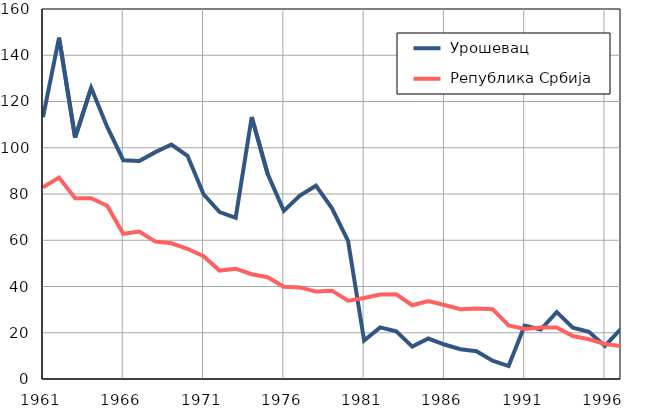
| Category |  Урошевац |  Република Србија |
|---|---|---|
| 1961.0 | 113.2 | 82.9 |
| 1962.0 | 147.6 | 87.1 |
| 1963.0 | 104.4 | 78.2 |
| 1964.0 | 125.9 | 78.2 |
| 1965.0 | 109 | 74.9 |
| 1966.0 | 94.6 | 62.8 |
| 1967.0 | 94.3 | 63.8 |
| 1968.0 | 98.1 | 59.4 |
| 1969.0 | 101.4 | 58.7 |
| 1970.0 | 96.5 | 56.3 |
| 1971.0 | 79.9 | 53.1 |
| 1972.0 | 72.2 | 46.9 |
| 1973.0 | 69.7 | 47.7 |
| 1974.0 | 113.3 | 45.3 |
| 1975.0 | 88.5 | 44 |
| 1976.0 | 72.7 | 39.9 |
| 1977.0 | 79.3 | 39.6 |
| 1978.0 | 83.6 | 37.8 |
| 1979.0 | 73.8 | 38.2 |
| 1980.0 | 59.7 | 33.9 |
| 1981.0 | 16.6 | 35 |
| 1982.0 | 22.3 | 36.5 |
| 1983.0 | 20.6 | 36.6 |
| 1984.0 | 14 | 31.9 |
| 1985.0 | 17.5 | 33.7 |
| 1986.0 | 14.9 | 32 |
| 1987.0 | 12.9 | 30.2 |
| 1988.0 | 12 | 30.5 |
| 1989.0 | 7.9 | 30.2 |
| 1990.0 | 5.6 | 23.2 |
| 1991.0 | 23.1 | 21.6 |
| 1992.0 | 21.4 | 22.3 |
| 1993.0 | 28.9 | 22.3 |
| 1994.0 | 22.2 | 18.6 |
| 1995.0 | 20.4 | 17.2 |
| 1996.0 | 14.3 | 15.1 |
| 1997.0 | 21.7 | 14.2 |